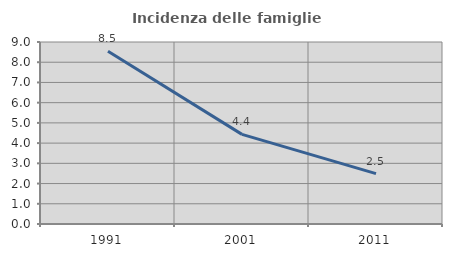
| Category | Incidenza delle famiglie numerose |
|---|---|
| 1991.0 | 8.545 |
| 2001.0 | 4.433 |
| 2011.0 | 2.494 |